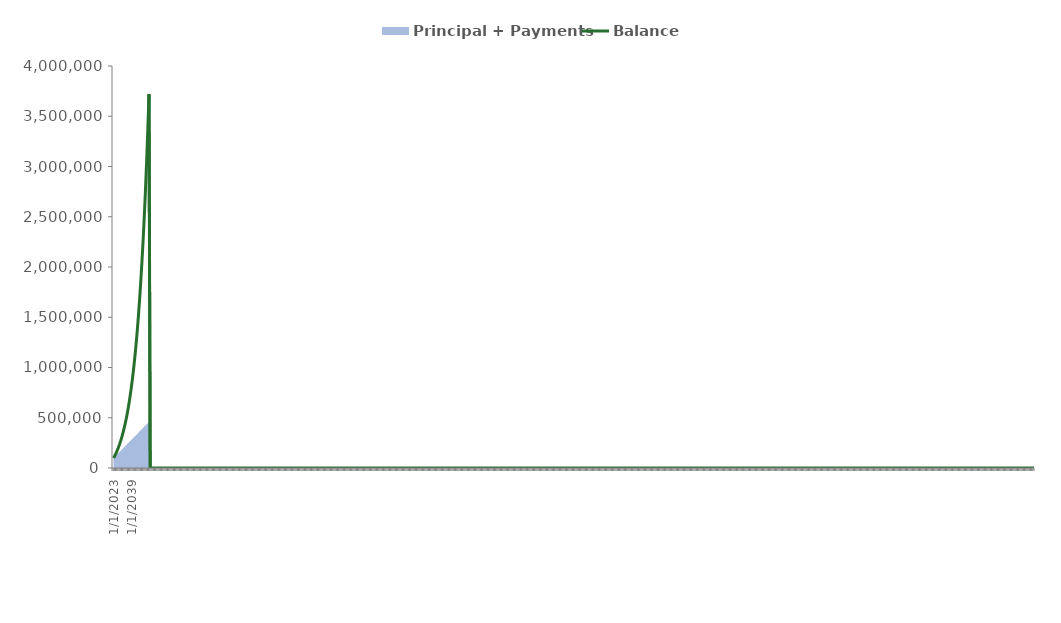
| Category | Balance |
|---|---|
| 1/1/2023 | 100000 |
| 1/1/2024 | 122000 |
| 1/1/2025 | 146200 |
| 1/1/2026 | 172820 |
| 1/1/2027 | 202102 |
| 1/1/2028 | 234312.2 |
| 1/1/2029 | 269743.42 |
| 1/1/2030 | 308717.762 |
| 1/1/2031 | 351589.538 |
| 1/1/2032 | 398748.492 |
| 1/1/2033 | 450623.341 |
| 1/1/2034 | 507685.675 |
| 1/1/2035 | 570454.243 |
| 1/1/2036 | 639499.667 |
| 1/1/2037 | 715449.634 |
| 1/1/2038 | 798994.597 |
| 1/1/2039 | 890894.057 |
| 1/1/2040 | 991983.463 |
| 1/1/2041 | 1103181.809 |
| 1/1/2042 | 1225499.99 |
| 1/1/2043 | 1360049.989 |
| 1/1/2044 | 1508054.988 |
| 1/1/2045 | 1670860.487 |
| 1/1/2046 | 1849946.535 |
| 1/1/2047 | 2046941.189 |
| 1/1/2048 | 2263635.308 |
| 1/1/2049 | 2501998.838 |
| 1/1/2050 | 2764198.722 |
| 1/1/2051 | 3052618.594 |
| 1/1/2052 | 3369880.454 |
| 1/1/2053 | 3718868.499 |